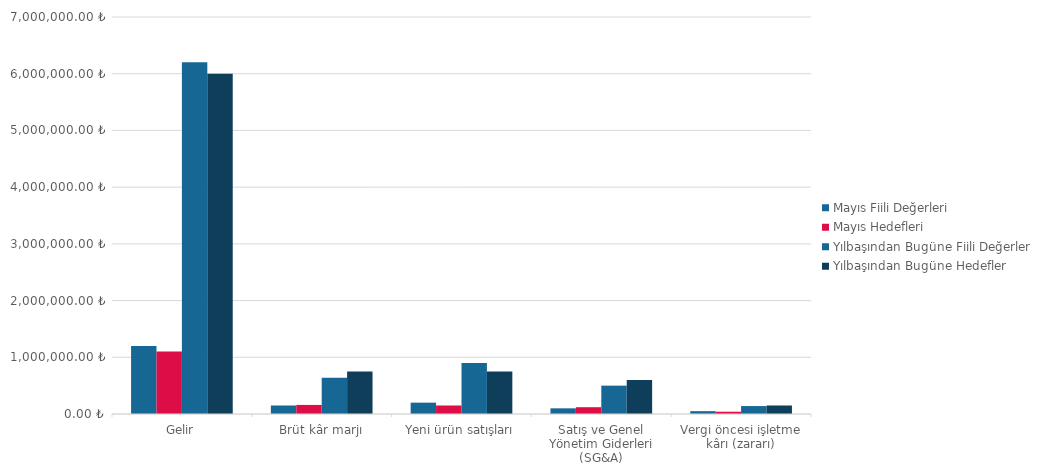
| Category | Mayıs Fiili Değerleri | Mayıs Hedefleri | Yılbaşından Bugüne Fiili Değerler | Yılbaşından Bugüne Hedefler |
|---|---|---|---|---|
| Gelir | 1200000 | 1100000 | 6200000 | 6000000 |
| Brüt kâr marjı | 150000 | 160000 | 640000 | 750000 |
| Yeni ürün satışları | 200000 | 150000 | 900000 | 750000 |
| Satış ve Genel Yönetim Giderleri (SG&A) | 100000 | 120000 | 500000 | 600000 |
| Vergi öncesi işletme kârı (zararı) | 50000 | 40000 | 140000 | 150000 |